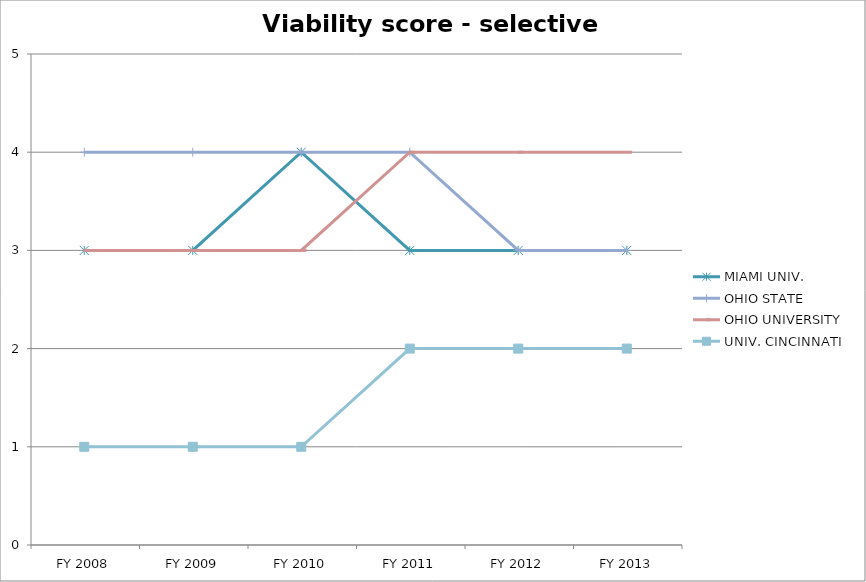
| Category | MIAMI UNIV.  | OHIO STATE  | OHIO UNIVERSITY  | UNIV. CINCINNATI  |
|---|---|---|---|---|
| FY 2013 | 3 | 3 | 4 | 2 |
| FY 2012 | 3 | 3 | 4 | 2 |
| FY 2011 | 3 | 4 | 4 | 2 |
| FY 2010 | 4 | 4 | 3 | 1 |
| FY 2009 | 3 | 4 | 3 | 1 |
| FY 2008 | 3 | 4 | 3 | 1 |